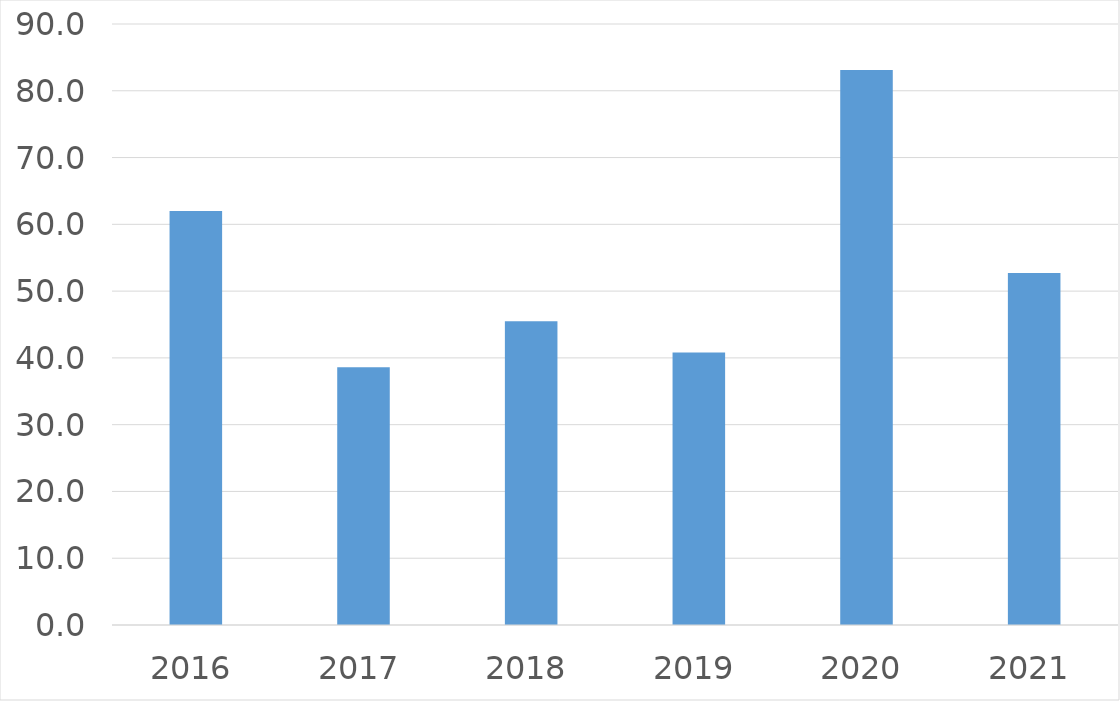
| Category | Series 0 |
|---|---|
| 2016 | 62 |
| 2017 | 38.6 |
| 2018 | 45.5 |
| 2019 | 40.8 |
| 2020 | 83.1 |
| 2021 | 52.7 |